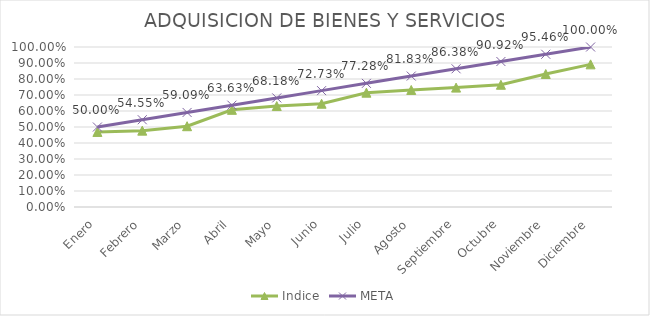
| Category | Indice | META |
|---|---|---|
| Enero | 0.469 | 0.5 |
| Febrero | 0.477 | 0.546 |
| Marzo | 0.505 | 0.591 |
| Abril | 0.607 | 0.636 |
| Mayo | 0.631 | 0.682 |
| Junio | 0.645 | 0.727 |
| Julio | 0.715 | 0.773 |
| Agosto | 0.732 | 0.818 |
| Septiembre | 0.746 | 0.864 |
| Octubre | 0.764 | 0.909 |
| Noviembre | 0.831 | 0.955 |
| Diciembre | 0.892 | 1 |